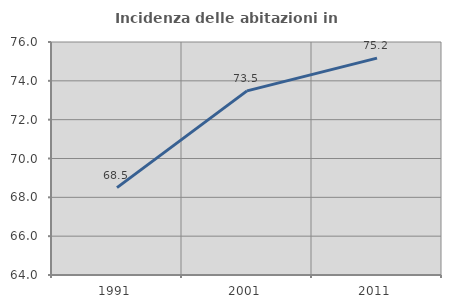
| Category | Incidenza delle abitazioni in proprietà  |
|---|---|
| 1991.0 | 68.5 |
| 2001.0 | 73.483 |
| 2011.0 | 75.167 |